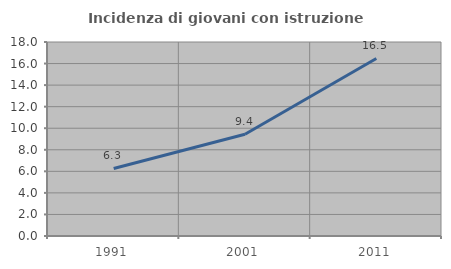
| Category | Incidenza di giovani con istruzione universitaria |
|---|---|
| 1991.0 | 6.269 |
| 2001.0 | 9.434 |
| 2011.0 | 16.47 |